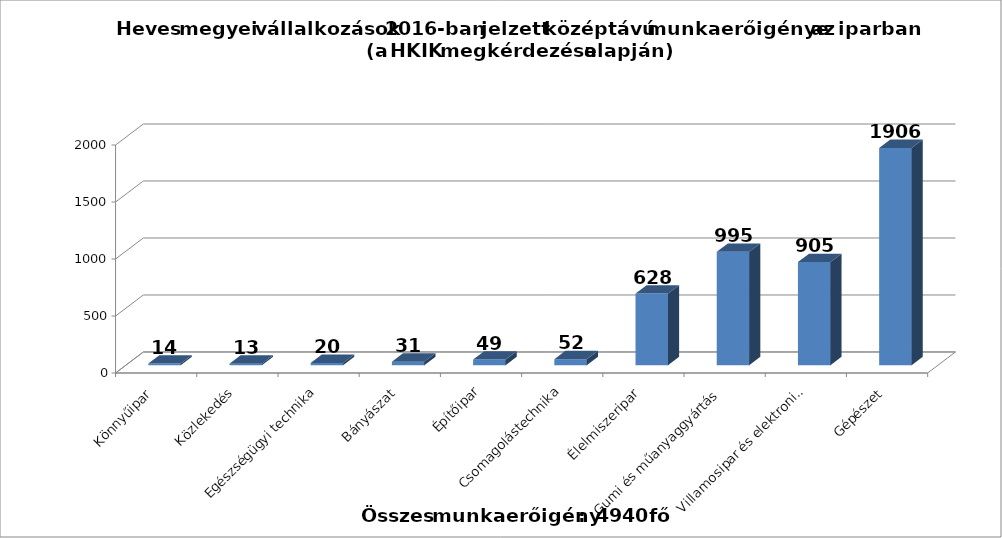
| Category | Series 0 |
|---|---|
| Könnyűipar | 14 |
| Közlekedés | 13 |
| Egészségügyi technika | 20 |
| Bányászat | 31 |
| Építőipar | 49 |
| Csomagolástechnika | 52 |
| Élelmiszeripar | 628 |
| Gumi és műanyaggyártás | 995 |
| Villamosipar és elektronika | 905 |
| Gépészet | 1906 |